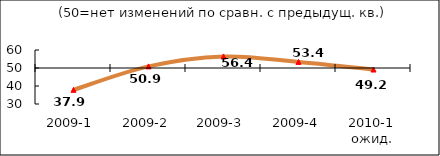
| Category | Диф.индекс ↓ |
|---|---|
| 2009-1 | 37.865 |
| 2009-2 | 50.89 |
| 2009-3 | 56.415 |
| 2009-4 | 53.385 |
| 2010-1 ожид. | 49.15 |